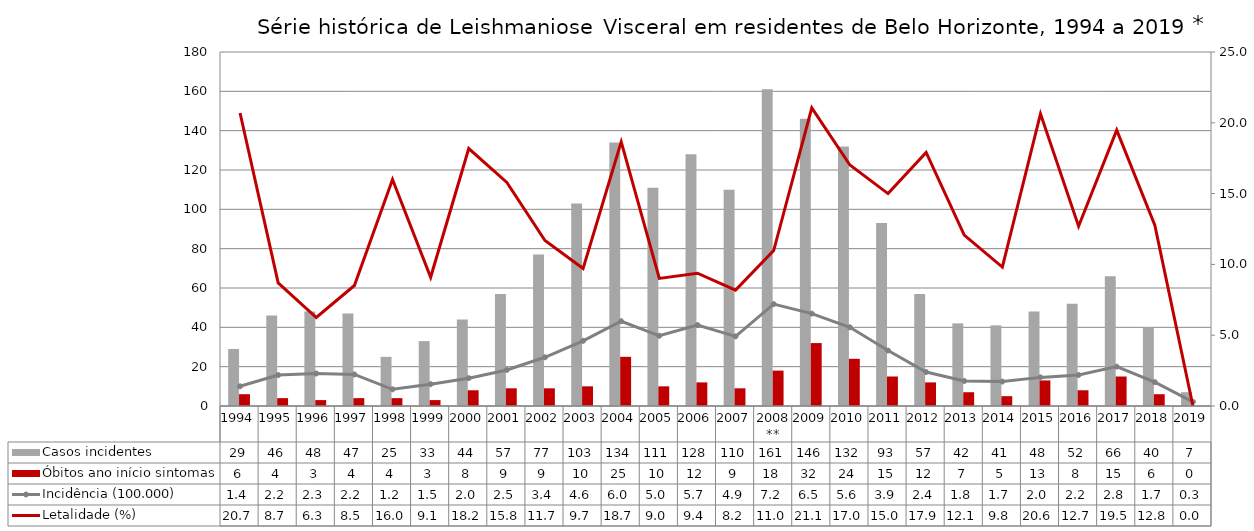
| Category | Casos incidentes | Óbitos ano início sintomas |
|---|---|---|
| 1994 | 29 | 6 |
| 1995 | 46 | 4 |
| 1996 | 48 | 3 |
| 1997 | 47 | 4 |
| 1998 | 25 | 4 |
| 1999 | 33 | 3 |
| 2000 | 44 | 8 |
| 2001 | 57 | 9 |
| 2002 | 77 | 9 |
| 2003 | 103 | 10 |
| 2004 | 134 | 25 |
| 2005 | 111 | 10 |
| 2006 | 128 | 12 |
| 2007 | 110 | 9 |
| 2008** | 161 | 18 |
| 2009 | 146 | 32 |
| 2010 | 132 | 24 |
| 2011 | 93 | 15 |
| 2012 | 57 | 12 |
| 2013 | 42 | 7 |
| 2014 | 41 | 5 |
| 2015 | 48 | 13 |
| 2016 | 52 | 8 |
| 2017 | 66 | 15 |
| 2018 | 40 | 6 |
| 2019 | 7 | 0 |